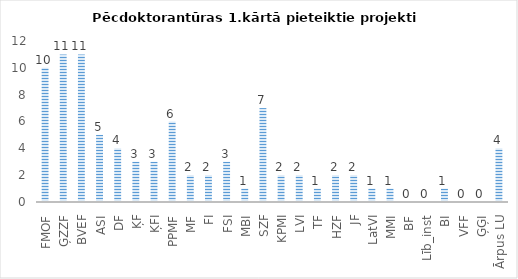
| Category | Series 0 |
|---|---|
| FMOF | 10 |
| ĢZZF | 11 |
| BVEF | 11 |
| ASI | 5 |
| DF | 4 |
| ĶF | 3 |
| ĶFI | 3 |
| PPMF | 6 |
| MF | 2 |
| FI | 2 |
| FSI | 3 |
| MBI | 1 |
| SZF | 7 |
| KPMI | 2 |
| LVI | 2 |
| TF | 1 |
| HZF | 2 |
| JF | 2 |
| LatVI | 1 |
| MMI | 1 |
| BF | 0 |
| Līb_inst | 0 |
| BI | 1 |
| VFF | 0 |
| ĢĢI | 0 |
| Ārpus LU | 4 |